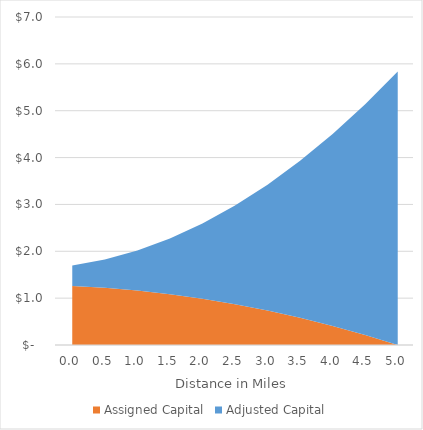
| Category | Assigned Capital | Adjusted Capital |
|---|---|---|
| 0.0 | 1260250.833 | 437925 |
| 0.5 | 1221183.057 | 605358.325 |
| 1.0 | 1162791.436 | 855608.133 |
| 1.5 | 1085075.968 | 1188674.425 |
| 2.0 | 988036.653 | 1604557.2 |
| 2.5 | 871673.493 | 2103256.458 |
| 3.0 | 735986.487 | 2684772.2 |
| 3.5 | 580975.634 | 3349104.425 |
| 4.0 | 406640.936 | 4096253.133 |
| 4.5 | 212982.391 | 4926218.325 |
| 5.0 | 0 | 5839000 |